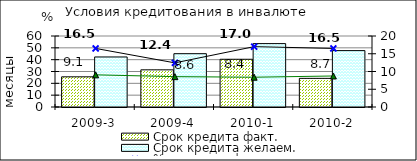
| Category | Срок кредита факт.  | Срок кредита желаем. |
|---|---|---|
| 2009-3 | 25.5 | 42.28 |
| 2009-4 | 31.4 | 45.06 |
| 2010-1 | 40.33 | 53.58 |
| 2010-2 | 24.2 | 47.66 |